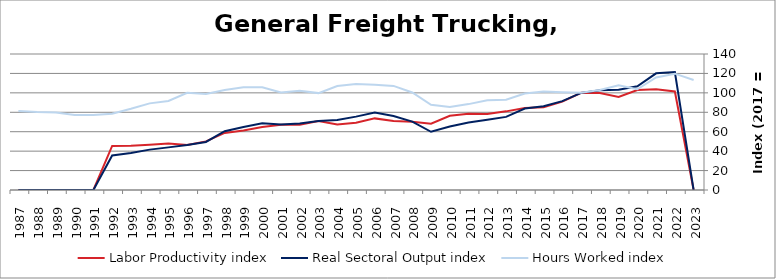
| Category | Labor Productivity index | Real Sectoral Output index | Hours Worked index |
|---|---|---|---|
| 2023.0 | 0 | 0 | 113.167 |
| 2022.0 | 101.382 | 121.401 | 119.747 |
| 2021.0 | 103.717 | 120.1 | 115.796 |
| 2020.0 | 102.973 | 106.752 | 103.67 |
| 2019.0 | 95.727 | 103.144 | 107.749 |
| 2018.0 | 99.77 | 102.796 | 103.033 |
| 2017.0 | 100 | 100 | 100 |
| 2016.0 | 90.974 | 91.488 | 100.565 |
| 2015.0 | 85.156 | 86.32 | 101.367 |
| 2014.0 | 84.35 | 83.825 | 99.377 |
| 2013.0 | 80.952 | 75.266 | 92.976 |
| 2012.0 | 78.222 | 72.301 | 92.43 |
| 2011.0 | 78.542 | 69.447 | 88.42 |
| 2010.0 | 76.441 | 65.357 | 85.5 |
| 2009.0 | 68.317 | 59.927 | 87.719 |
| 2008.0 | 70.153 | 70.395 | 100.345 |
| 2007.0 | 71.057 | 76.162 | 107.185 |
| 2006.0 | 73.718 | 79.859 | 108.331 |
| 2005.0 | 69.241 | 75.517 | 109.064 |
| 2004.0 | 67.408 | 72.152 | 107.037 |
| 2003.0 | 71.095 | 70.908 | 99.737 |
| 2002.0 | 67.151 | 68.565 | 102.106 |
| 2001.0 | 67.206 | 67.528 | 100.478 |
| 2000.0 | 64.907 | 68.591 | 105.675 |
| 1999.0 | 61.351 | 64.919 | 105.815 |
| 1998.0 | 58.717 | 60.492 | 103.022 |
| 1997.0 | 50.026 | 49.422 | 98.792 |
| 1996.0 | 46.34 | 46.365 | 100.054 |
| 1995.0 | 47.907 | 43.877 | 91.588 |
| 1994.0 | 46.616 | 41.567 | 89.169 |
| 1993.0 | 45.591 | 38.096 | 83.562 |
| 1992.0 | 45.352 | 35.607 | 78.512 |
| 1991.0 | 0 | 0 | 77.224 |
| 1990.0 | 0 | 0 | 77.119 |
| 1989.0 | 0 | 0 | 79.892 |
| 1988.0 | 0 | 0 | 80.205 |
| 1987.0 | 0 | 0 | 81.287 |